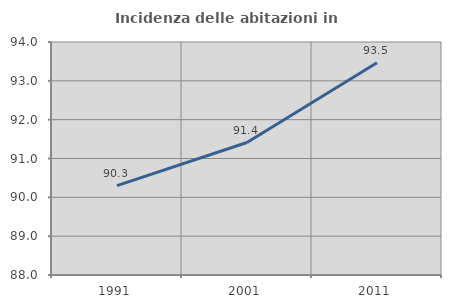
| Category | Incidenza delle abitazioni in proprietà  |
|---|---|
| 1991.0 | 90.303 |
| 2001.0 | 91.411 |
| 2011.0 | 93.464 |